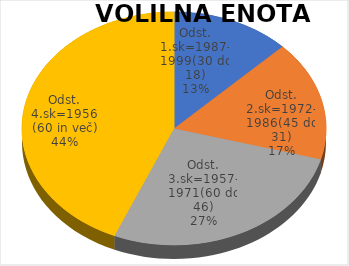
| Category | VOLILNA ENOTA 06 |
|---|---|
| Odst. 1.sk=1987-1999(30 do 18) | 2.68 |
| Odst. 2.sk=1972-1986(45 do 31) | 3.54 |
| Odst. 3.sk=1957-1971(60 do 46) | 5.76 |
| Odst. 4.sk=1956 (60 in več) | 9.27 |